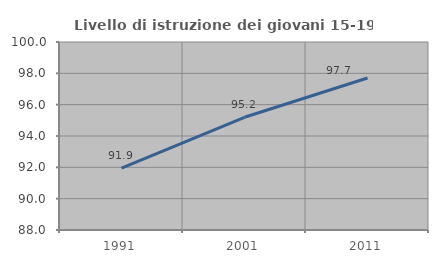
| Category | Livello di istruzione dei giovani 15-19 anni |
|---|---|
| 1991.0 | 91.942 |
| 2001.0 | 95.193 |
| 2011.0 | 97.704 |